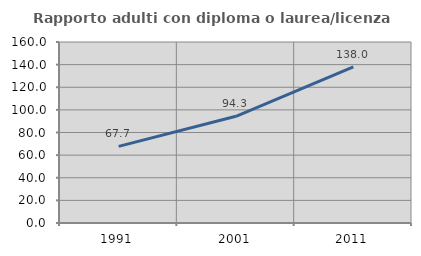
| Category | Rapporto adulti con diploma o laurea/licenza media  |
|---|---|
| 1991.0 | 67.747 |
| 2001.0 | 94.314 |
| 2011.0 | 137.982 |